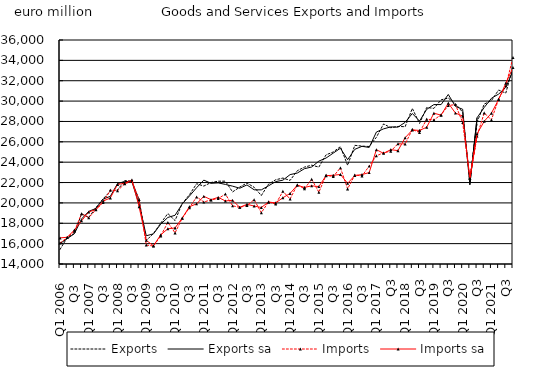
| Category | Exports | Exports sa | Imports | Imports sa |
|---|---|---|---|---|
| Q1 2006 | 15426.43 | 16005.852 | 16053.685 | 16562.93 |
| Q2  | 16590.978 | 16490.917 | 16608.244 | 16624.278 |
| Q3  | 16995.471 | 16974.367 | 17211.858 | 17340.248 |
| Q4  | 18927.467 | 18424.86 | 18944.786 | 18238.615 |
| Q1 2007 | 18569.706 | 19167.081 | 18549.336 | 19112.406 |
| Q2  | 19546.062 | 19461.042 | 19320.787 | 19348.904 |
| Q3  | 20403.104 | 20376.458 | 20036.717 | 20177.781 |
| Q4  | 21150.52 | 20647.464 | 21256.589 | 20486.557 |
| Q1 2008 | 21269.44 | 21891.168 | 21193.006 | 21815.587 |
| Q2  | 22190.854 | 22113.396 | 21882.106 | 21921.075 |
| Q3  | 22137.257 | 22073.685 | 22119.513 | 22264.007 |
| Q4  | 20315.896 | 19872.295 | 20343.168 | 19624.45 |
| Q1 2009 | 16305.175 | 16774.383 | 15866.088 | 16322.495 |
| Q2  | 17005.07 | 16961.054 | 15760.284 | 15790.303 |
| Q3  | 17996.865 | 17908.78 | 16756.331 | 16857.821 |
| Q4  | 18959.047 | 18571.651 | 18082.611 | 17461.264 |
| Q1 2010 | 18266.014 | 18785.288 | 17055.865 | 17538.949 |
| Q2  | 19948.415 | 19899.801 | 18489.035 | 18518.663 |
| Q3  | 20800.078 | 20670.334 | 19518.81 | 19630.746 |
| Q4  | 21886.231 | 21494.348 | 20590.053 | 19905.652 |
| Q1 2011 | 21652.235 | 22239.31 | 20088.377 | 20646.958 |
| Q2  | 22001.837 | 21924.636 | 20296.711 | 20317.036 |
| Q3  | 22132.092 | 21965.971 | 20430.095 | 20545.812 |
| Q4  | 22135.884 | 21817.001 | 20863.833 | 20194.448 |
| Q1 2012 | 21078.348 | 21645.708 | 19714.702 | 20255.082 |
| Q2  | 21554.499 | 21442.619 | 19562.096 | 19565.875 |
| Q3  | 21957.489 | 21765.241 | 19752.864 | 19865.86 |
| Q4  | 21533.575 | 21286.989 | 20318.036 | 19688.249 |
| Q1 2013 | 20728.824 | 21282.525 | 19035.923 | 19552.477 |
| Q2  | 21840.877 | 21680.464 | 20099.466 | 20083.879 |
| Q3  | 22275.041 | 22090.762 | 19885.285 | 20001.608 |
| Q4  | 22438.839 | 22232.458 | 21139.693 | 20507.353 |
| Q1 2014 | 22211.586 | 22780.406 | 20386.331 | 20932.968 |
| Q2  | 23160.819 | 22931.814 | 21775.801 | 21740.218 |
| Q3  | 23514.842 | 23361.65 | 21396.177 | 21522.052 |
| Q4  | 23707.025 | 23528.091 | 22323.657 | 21678.839 |
| Q1 2015 | 23518.369 | 24104.225 | 21046.864 | 21601.748 |
| Q2  | 24719.198 | 24407.397 | 22721.94 | 22674.375 |
| Q3  | 25000.6 | 24889.884 | 22584.907 | 22717.65 |
| Q4 | 25524.158 | 25369.154 | 23449.599 | 22794.419 |
| Q1 2016 | 23694.111 | 24242.032 | 21377.937 | 21922.452 |
| Q2  | 25652.128 | 25262.476 | 22740.689 | 22690.058 |
| Q3  | 25578.857 | 25555.997 | 22646.594 | 22783.824 |
| Q4 | 25541.098 | 25446.787 | 23617.186 | 22980.743 |
| Q1 2017 | 26447.921 | 26958.98 | 24630.671 | 25231.057 |
| Q2  | 27757.157 | 27271.259 | 24922.894 | 24865.137 |
| Q3 | 27383.336 | 27464.631 | 25079.92 | 25233.552 |
| Q4 | 27513.295 | 27439.943 | 25809.639 | 25132.361 |
| Q1 2018 | 27484.502 | 27914.633 | 25788.488 | 26398.756 |
| Q2  | 29281.432 | 28783.142 | 27214.07 | 27166.439 |
| Q3 | 27800.601 | 28038.855 | 26913.488 | 27120.015 |
| Q4 | 29372.604 | 29189.125 | 28223.158 | 27434.33 |
| Q1 2019 | 29284.483 | 29657.698 | 28154.517 | 28811.611 |
| Q2  | 30123.019 | 29657.972 | 28662.822 | 28620.001 |
| Q3 | 30298.27 | 30649.35 | 29564.365 | 29796.402 |
| Q4 | 29736.207 | 29474.448 | 29657.32 | 28819.907 |
| Q1 2020 | 28910.279 | 29197.347 | 27891.543 | 28537.154 |
| Q2  | 22084.641 | 21786.006 | 22457.884 | 22429.218 |
| Q3 | 27924.12 | 28363.25 | 26566.545 | 26783.238 |
| Q4 | 29707.178 | 29378.918 | 28841.194 | 28019.314 |
| Q1 2021 | 30050.022 | 30276.169 | 28159.238 | 28810.49 |
| Q2  | 31087.856 | 30686.848 | 30198.607 | 30162.639 |
| Q3 | 30784.158 | 31349.655 | 31494.456 | 31754.079 |
| Q4 | 33391.917 | 32969.63 | 34291.233 | 33306.058 |